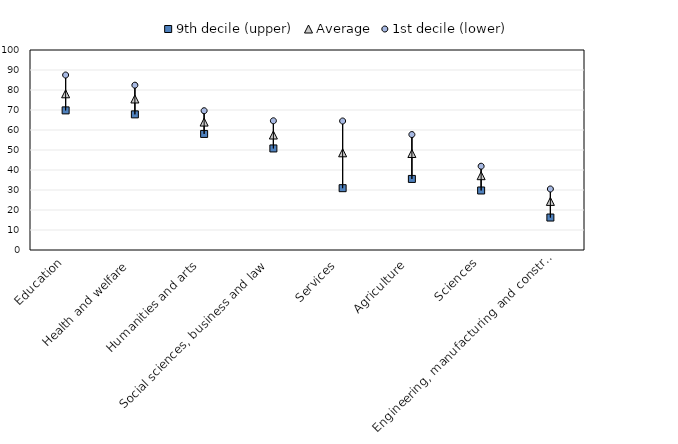
| Category | 9th decile (upper) | Average | 1st decile (lower) |
|---|---|---|---|
|  Education | 69.805 | 78.102 | 87.492 |
|  Health and welfare  | 67.815 | 75.511 | 82.413 |
|  Humanities and arts  | 58.036 | 63.963 | 69.633 |
|  Social sciences, business and law  | 50.777 | 57.49 | 64.61 |
|  Services  | 30.907 | 48.595 | 64.507 |
|  Agriculture  | 35.535 | 48.248 | 57.72 |
| Sciences | 29.754 | 37.159 | 41.896 |
|  Engineering, manufacturing and construction  | 16.227 | 24.294 | 30.508 |